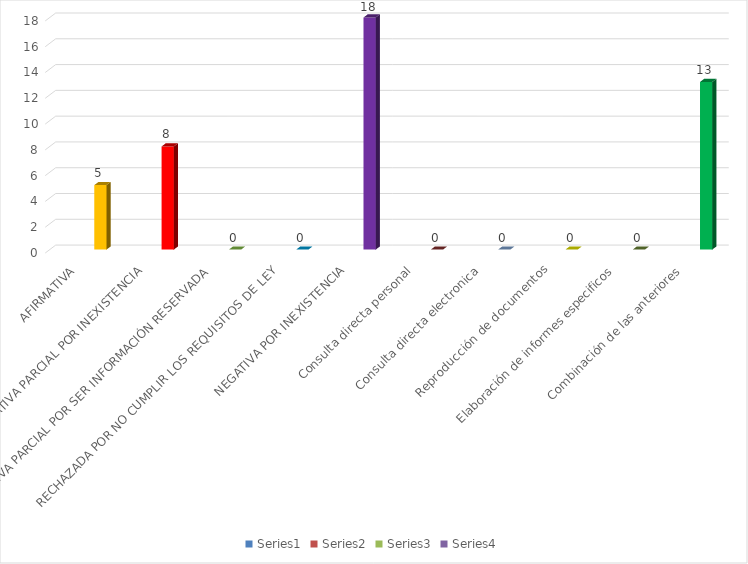
| Category | Series 0 | Series 1 | Series 2 | Series 3 |
|---|---|---|---|---|
| AFIRMATIVA |  |  |  | 5 |
| AFIRMATIVA PARCIAL POR INEXISTENCIA |  |  |  | 8 |
| AFIRMATIVA PARCIAL POR SER INFORMACIÓN RESERVADA |  |  |  | 0 |
| RECHAZADA POR NO CUMPLIR LOS REQUISITOS DE LEY |  |  |  | 0 |
| NEGATIVA POR INEXISTENCIA |  |  |  | 18 |
| Consulta directa personal |  |  |  | 0 |
| Consulta directa electronica |  |  |  | 0 |
| Reproducción de documentos |  |  |  | 0 |
| Elaboración de informes especificos |  |  |  | 0 |
| Combinación de las anteriores |  |  |  | 13 |